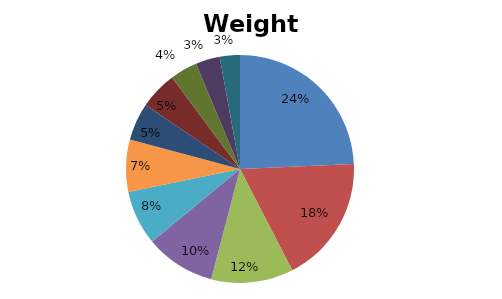
| Category | Pesos |
|---|---|
| C1 | 0.243 |
| C2 | 0.181 |
| C3 | 0.116 |
| C4 | 0.099 |
| C5 | 0.077 |
| C6 | 0.074 |
| C7 | 0.053 |
| C8 | 0.054 |
| C9 | 0.039 |
| C10 | 0.034 |
| C11 | 0.029 |